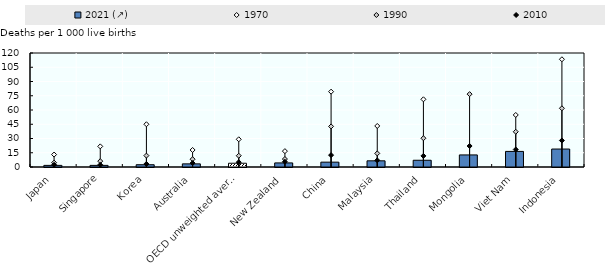
| Category | 2021 (↗) |
|---|---|
| Japan | 1.7 |
| Singapore | 1.7 |
| Korea | 2.4 |
| Australia | 3.3 |
| OECD unweighted average (c) | 3.96 |
| New Zealand | 4.3 |
| China | 5.1 |
| Malaysia | 6.5 |
| Thailand | 7.1 |
| Mongolia | 12.7 |
| Viet Nam | 16.4 |
| Indonesia | 18.9 |